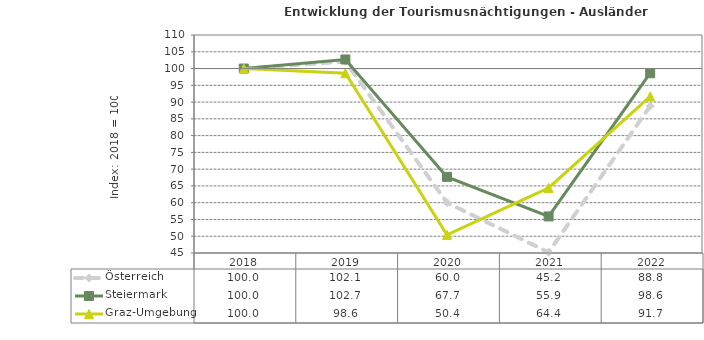
| Category | Österreich | Steiermark | Graz-Umgebung |
|---|---|---|---|
| 2022.0 | 88.8 | 98.6 | 91.7 |
| 2021.0 | 45.2 | 55.9 | 64.4 |
| 2020.0 | 60 | 67.7 | 50.4 |
| 2019.0 | 102.1 | 102.7 | 98.6 |
| 2018.0 | 100 | 100 | 100 |